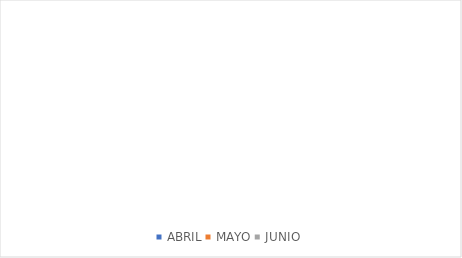
| Category | Series 0 |
|---|---|
| ABRIL | 0 |
| MAYO | 0 |
| JUNIO | 0 |